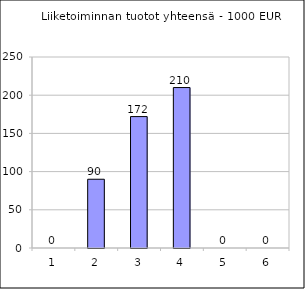
| Category | Liiketoiminnan tuotot yht. |
|---|---|
| 0 | 0 |
| 1 | 90000 |
| 2 | 172000 |
| 3 | 210000 |
| 4 | 0 |
| 5 | 0 |